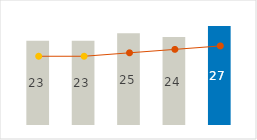
| Category | Freight & Forwarding |
|---|---|
| 0 | 23 |
| 1 | 23 |
| 2 | 25 |
| 3 | 24 |
| 4 | 27 |